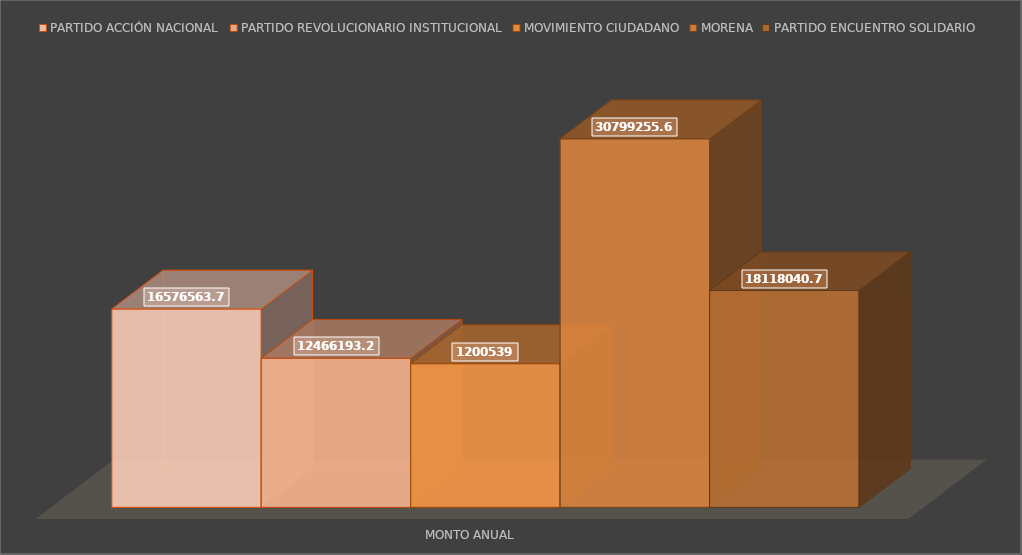
| Category | PARTIDO ACCIÓN NACIONAL | PARTIDO REVOLUCIONARIO INSTITUCIONAL | MOVIMIENTO CIUDADANO | MORENA | PARTIDO ENCUENTRO SOLIDARIO |
|---|---|---|---|---|---|
| MONTO ANUAL | 16576563.72 | 12466193.25 | 12005391 | 30799255.68 | 18118040.71 |